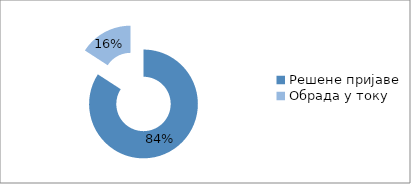
| Category | Series 0 |
|---|---|
| Решене пријаве | 8209 |
| Обрада у току | 1545 |